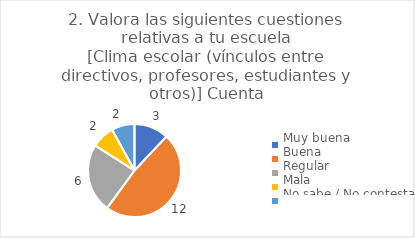
| Category | 2. Valora las siguientes cuestiones relativas a tu escuela
[Clima escolar (vínculos entre directivos, profesores, estudiantes y otros)] |
|---|---|
| Muy buena  | 0.12 |
| Buena  | 0.48 |
| Regular  | 0.24 |
| Mala  | 0.08 |
| No sabe / No contesta | 0.08 |